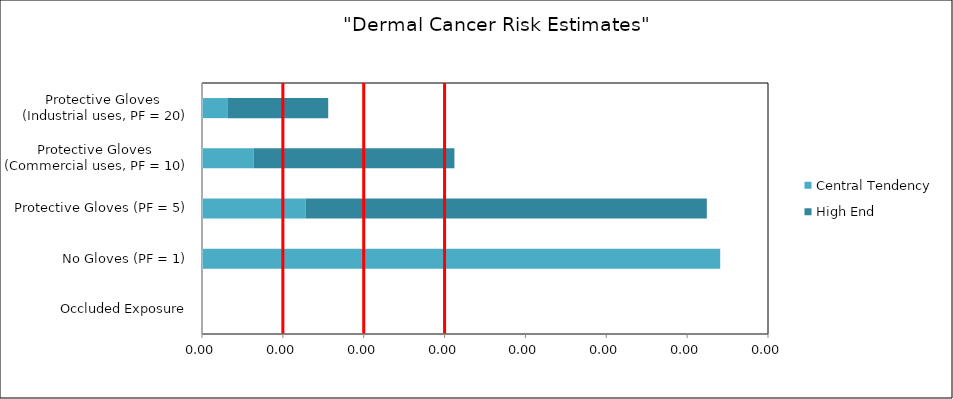
| Category | Central Tendency | High End |
|---|---|---|
| Occluded Exposure | 0 | 0 |
| No Gloves (PF = 1) | 0.001 | 0 |
| Protective Gloves (PF = 5) | 0 | 0 |
| Protective Gloves 
(Commercial uses, PF = 10) | 0 | 0 |
| Protective Gloves 
(Industrial uses, PF = 20) | 0 | 0 |